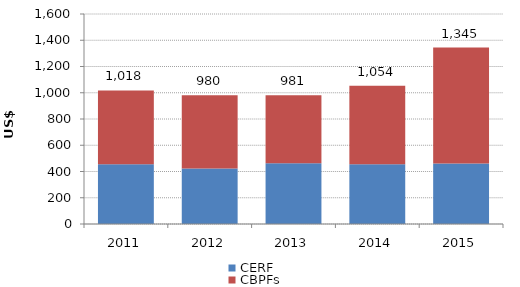
| Category | CERF | CBPFs |
|---|---|---|
| 2011.0 | 454.925 | 563.169 |
| 2012.0 | 422.394 | 557.919 |
| 2013.0 | 462.033 | 519.052 |
| 2014.0 | 455.506 | 598.304 |
| 2015.0 | 461.716 | 882.865 |